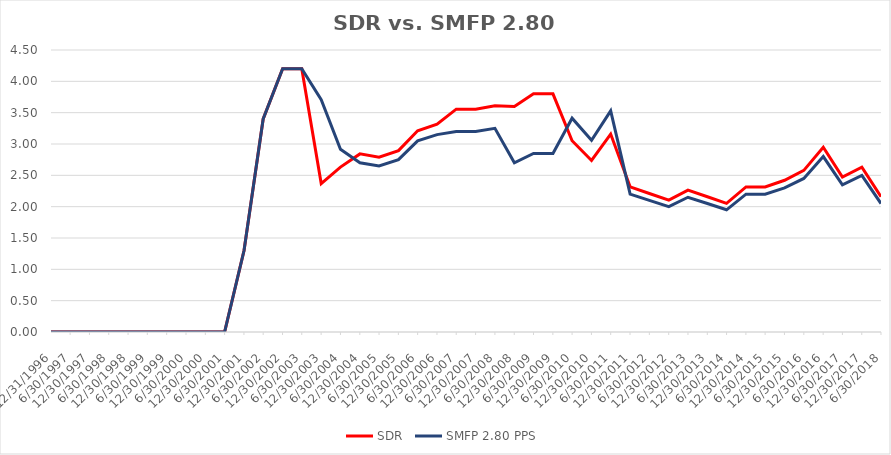
| Category | SDR | SMFP 2.80 PPS |
|---|---|---|
| 12/31/96 | 0 | 0 |
| 6/30/97 | 0 | 0 |
| 12/31/97 | 0 | 0 |
| 6/30/98 | 0 | 0 |
| 12/31/98 | 0 | 0 |
| 6/30/99 | 0 | 0 |
| 12/31/99 | 0 | 0 |
| 6/30/00 | 0 | 0 |
| 12/31/00 | 0 | 0 |
| 6/30/01 | 0 | 0 |
| 12/31/01 | 1.3 | 1.3 |
| 6/30/02 | 3.4 | 3.4 |
| 12/31/02 | 4.2 | 4.2 |
| 6/30/03 | 4.2 | 4.2 |
| 12/31/03 | 2.368 | 3.706 |
| 6/30/04 | 2.632 | 2.917 |
| 12/31/04 | 2.842 | 2.7 |
| 6/30/05 | 2.789 | 2.65 |
| 12/31/05 | 2.895 | 2.75 |
| 6/30/06 | 3.211 | 3.05 |
| 12/31/06 | 3.316 | 3.15 |
| 6/30/07 | 3.556 | 3.2 |
| 12/31/07 | 3.556 | 3.2 |
| 6/30/08 | 3.611 | 3.25 |
| 12/31/08 | 3.6 | 2.7 |
| 6/30/09 | 3.8 | 2.85 |
| 12/31/09 | 3.8 | 2.85 |
| 6/30/10 | 3.053 | 3.412 |
| 12/31/10 | 2.737 | 3.059 |
| 6/30/11 | 3.158 | 3.529 |
| 12/31/11 | 2.316 | 2.2 |
| 6/30/12 | 2.211 | 2.1 |
| 12/31/12 | 2.105 | 2 |
| 6/30/13 | 2.263 | 2.15 |
| 12/31/13 | 2.158 | 2.05 |
| 6/30/14 | 2.053 | 1.95 |
| 12/31/14 | 2.316 | 2.2 |
| 6/30/15 | 2.316 | 2.2 |
| 12/31/15 | 2.421 | 2.3 |
| 6/30/16 | 2.579 | 2.45 |
| 12/31/16 | 2.947 | 2.8 |
| 6/30/17 | 2.474 | 2.35 |
| 12/31/17 | 2.632 | 2.5 |
| 6/30/18 | 2.158 | 2.05 |